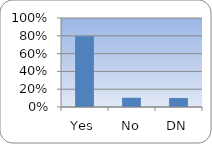
| Category | Series 0 |
|---|---|
| Yes | 0.796 |
| No | 0.104 |
| DN | 0.101 |